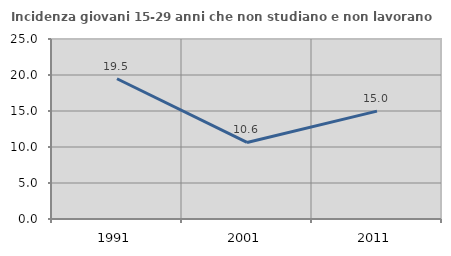
| Category | Incidenza giovani 15-29 anni che non studiano e non lavorano  |
|---|---|
| 1991.0 | 19.481 |
| 2001.0 | 10.635 |
| 2011.0 | 14.981 |